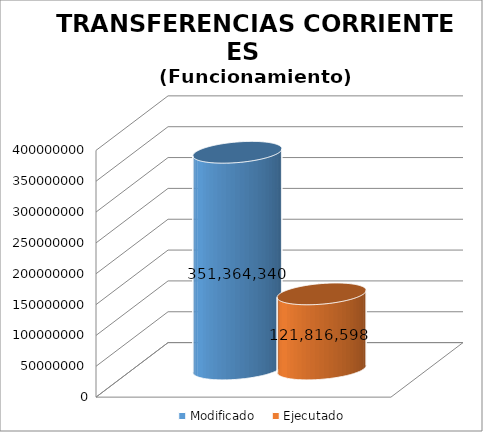
| Category | Modificado | Ejecutado |
|---|---|---|
| 0 | 351364340 | 121816597.56 |